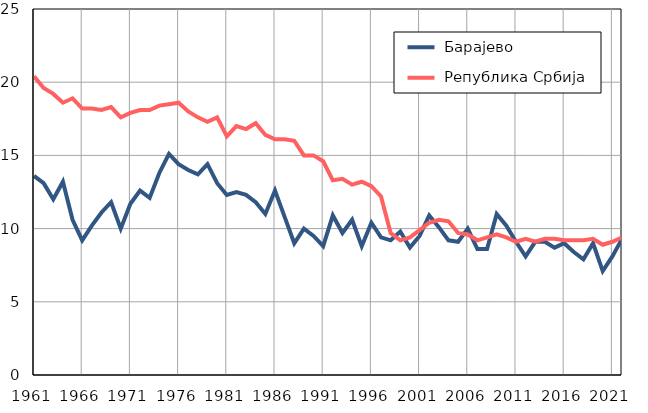
| Category |  Барајево |  Република Србија |
|---|---|---|
| 1961.0 | 13.6 | 20.4 |
| 1962.0 | 13.1 | 19.6 |
| 1963.0 | 12 | 19.2 |
| 1964.0 | 13.2 | 18.6 |
| 1965.0 | 10.6 | 18.9 |
| 1966.0 | 9.2 | 18.2 |
| 1967.0 | 10.2 | 18.2 |
| 1968.0 | 11.1 | 18.1 |
| 1969.0 | 11.8 | 18.3 |
| 1970.0 | 10 | 17.6 |
| 1971.0 | 11.7 | 17.9 |
| 1972.0 | 12.6 | 18.1 |
| 1973.0 | 12.1 | 18.1 |
| 1974.0 | 13.8 | 18.4 |
| 1975.0 | 15.1 | 18.5 |
| 1976.0 | 14.4 | 18.6 |
| 1977.0 | 14 | 18 |
| 1978.0 | 13.7 | 17.6 |
| 1979.0 | 14.4 | 17.3 |
| 1980.0 | 13.1 | 17.6 |
| 1981.0 | 12.3 | 16.3 |
| 1982.0 | 12.5 | 17 |
| 1983.0 | 12.3 | 16.8 |
| 1984.0 | 11.8 | 17.2 |
| 1985.0 | 11 | 16.4 |
| 1986.0 | 12.6 | 16.1 |
| 1987.0 | 10.8 | 16.1 |
| 1988.0 | 9 | 16 |
| 1989.0 | 10 | 15 |
| 1990.0 | 9.5 | 15 |
| 1991.0 | 8.8 | 14.6 |
| 1992.0 | 10.9 | 13.3 |
| 1993.0 | 9.7 | 13.4 |
| 1994.0 | 10.6 | 13 |
| 1995.0 | 8.8 | 13.2 |
| 1996.0 | 10.4 | 12.9 |
| 1997.0 | 9.4 | 12.2 |
| 1998.0 | 9.2 | 9.7 |
| 1999.0 | 9.8 | 9.2 |
| 2000.0 | 8.7 | 9.4 |
| 2001.0 | 9.5 | 9.9 |
| 2002.0 | 10.9 | 10.4 |
| 2003.0 | 10.1 | 10.6 |
| 2004.0 | 9.2 | 10.5 |
| 2005.0 | 9.1 | 9.7 |
| 2006.0 | 10 | 9.6 |
| 2007.0 | 8.6 | 9.2 |
| 2008.0 | 8.6 | 9.4 |
| 2009.0 | 11 | 9.6 |
| 2010.0 | 10.2 | 9.4 |
| 2011.0 | 9.1 | 9.1 |
| 2012.0 | 8.1 | 9.3 |
| 2013.0 | 9.1 | 9.1 |
| 2014.0 | 9.1 | 9.3 |
| 2015.0 | 8.7 | 9.3 |
| 2016.0 | 9 | 9.2 |
| 2017.0 | 8.4 | 9.2 |
| 2018.0 | 7.9 | 9.2 |
| 2019.0 | 9 | 9.3 |
| 2020.0 | 7.1 | 8.9 |
| 2021.0 | 8.1 | 9.1 |
| 2022.0 | 9.3 | 9.4 |